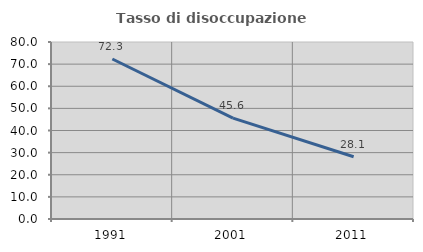
| Category | Tasso di disoccupazione giovanile  |
|---|---|
| 1991.0 | 72.321 |
| 2001.0 | 45.614 |
| 2011.0 | 28.125 |